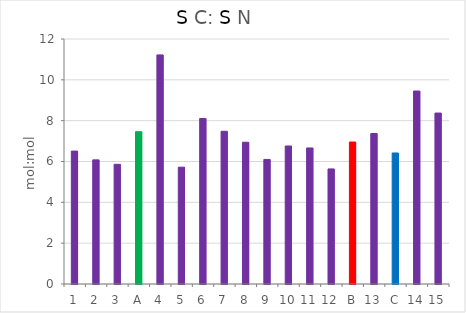
| Category | Stot PC (mmol m-2) |
|---|---|
| 1 | 6.509 |
| 2 | 6.08 |
| 3 | 5.863 |
| A | 7.463 |
| 4 | 11.221 |
| 5 | 5.722 |
| 6 | 8.108 |
| 7 | 7.48 |
| 8 | 6.944 |
| 9 | 6.1 |
| 10 | 6.76 |
| 11 | 6.664 |
| 12 | 5.635 |
| B | 6.955 |
| 13 | 7.37 |
| C | 6.417 |
| 14 | 9.452 |
| 15 | 8.373 |